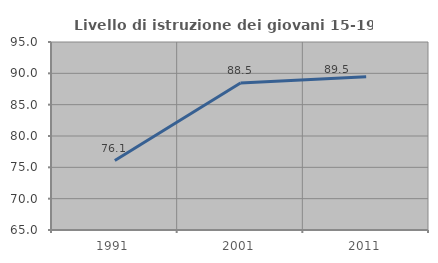
| Category | Livello di istruzione dei giovani 15-19 anni |
|---|---|
| 1991.0 | 76.087 |
| 2001.0 | 88.451 |
| 2011.0 | 89.464 |